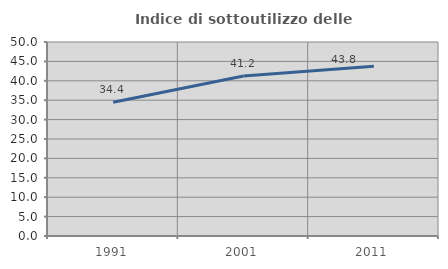
| Category | Indice di sottoutilizzo delle abitazioni  |
|---|---|
| 1991.0 | 34.45 |
| 2001.0 | 41.235 |
| 2011.0 | 43.774 |